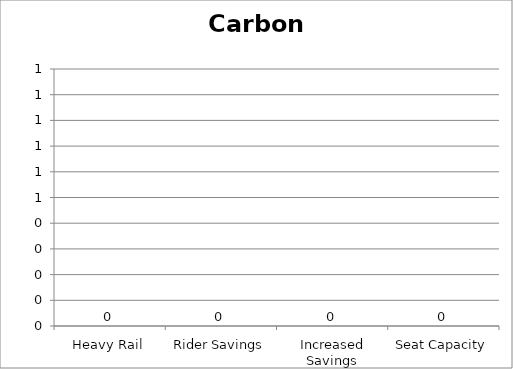
| Category | Carbon Monoxide |
|---|---|
| Heavy Rail | 0 |
| Rider Savings | 0 |
| Increased Savings | 0 |
| Seat Capacity | 0 |